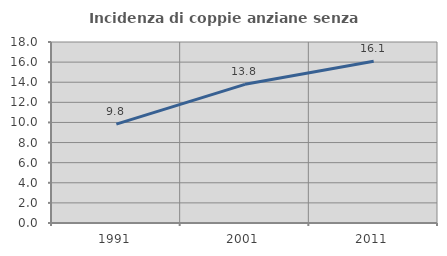
| Category | Incidenza di coppie anziane senza figli  |
|---|---|
| 1991.0 | 9.829 |
| 2001.0 | 13.789 |
| 2011.0 | 16.077 |